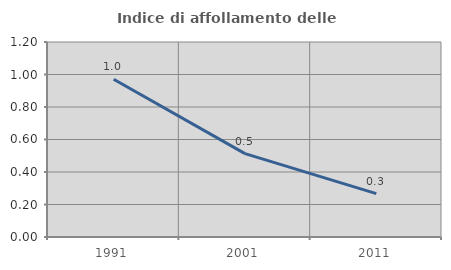
| Category | Indice di affollamento delle abitazioni  |
|---|---|
| 1991.0 | 0.971 |
| 2001.0 | 0.513 |
| 2011.0 | 0.267 |